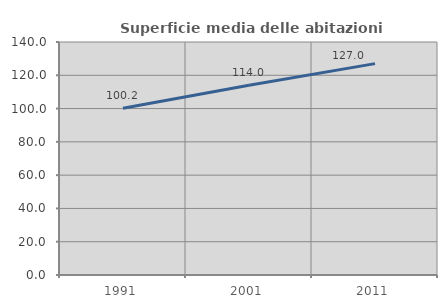
| Category | Superficie media delle abitazioni occupate |
|---|---|
| 1991.0 | 100.214 |
| 2001.0 | 113.96 |
| 2011.0 | 127.005 |